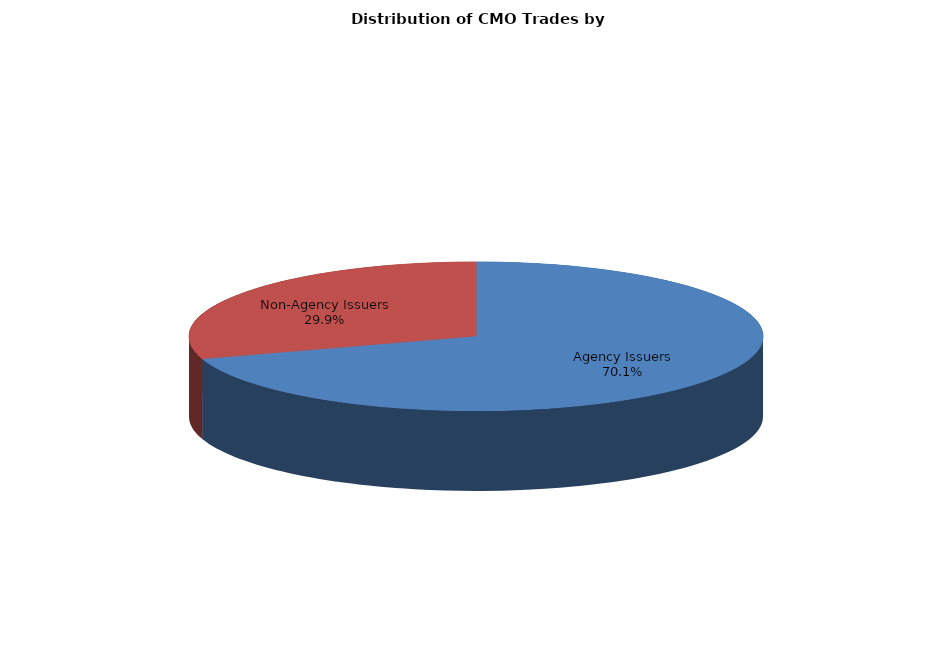
| Category | Series 0 |
|---|---|
| Agency Issuers | 1097.403 |
| Non-Agency Issuers | 468.628 |